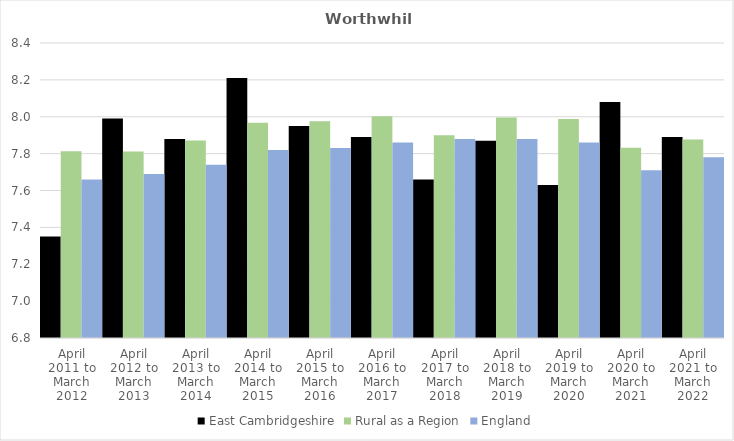
| Category | East Cambridgeshire | Rural as a Region | England |
|---|---|---|---|
| April 2011 to March 2012 | 7.35 | 7.813 | 7.66 |
| April 2012 to March 2013 | 7.99 | 7.811 | 7.69 |
| April 2013 to March 2014 | 7.88 | 7.871 | 7.74 |
| April 2014 to March 2015 | 8.21 | 7.967 | 7.82 |
| April 2015 to March 2016 | 7.95 | 7.975 | 7.83 |
| April 2016 to March 2017 | 7.89 | 8.002 | 7.86 |
| April 2017 to March 2018 | 7.66 | 7.9 | 7.88 |
| April 2018 to March 2019 | 7.87 | 7.996 | 7.88 |
| April 2019 to March 2020 | 7.63 | 7.988 | 7.86 |
| April 2020 to March 2021 | 8.08 | 7.831 | 7.71 |
| April 2021 to March 2022 | 7.89 | 7.877 | 7.78 |